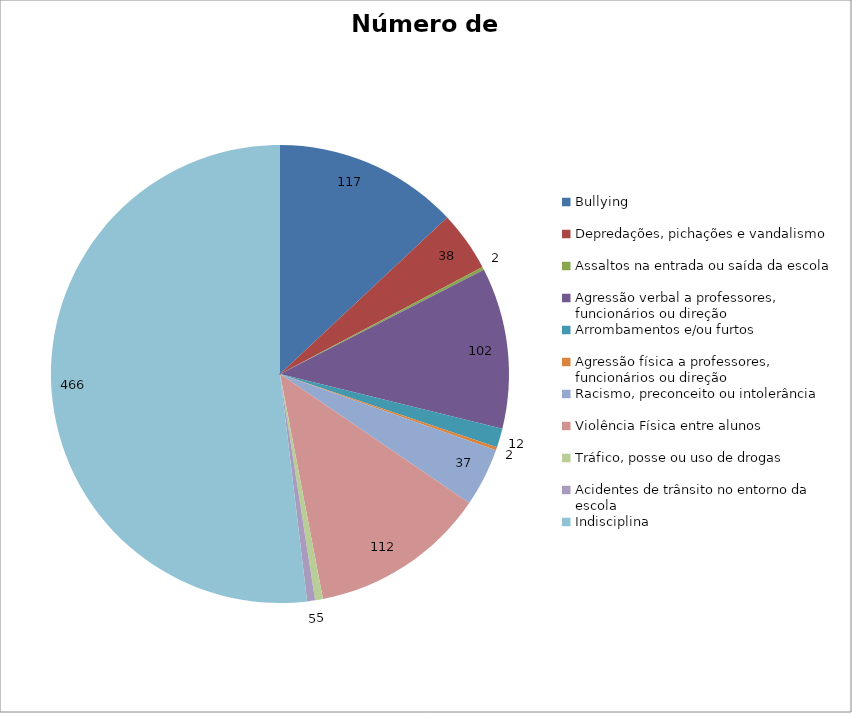
| Category | Número de Casos |
|---|---|
| Bullying | 117 |
| Depredações, pichações e vandalismo | 38 |
| Assaltos na entrada ou saída da escola | 2 |
| Agressão verbal a professores, funcionários ou direção | 102 |
| Arrombamentos e/ou furtos | 12 |
| Agressão física a professores, funcionários ou direção | 2 |
| Racismo, preconceito ou intolerância | 37 |
| Violência Física entre alunos | 112 |
| Tráfico, posse ou uso de drogas | 5 |
| Acidentes de trânsito no entorno da escola | 5 |
| Indisciplina | 466 |